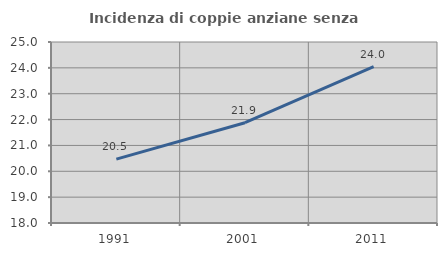
| Category | Incidenza di coppie anziane senza figli  |
|---|---|
| 1991.0 | 20.469 |
| 2001.0 | 21.879 |
| 2011.0 | 24.043 |